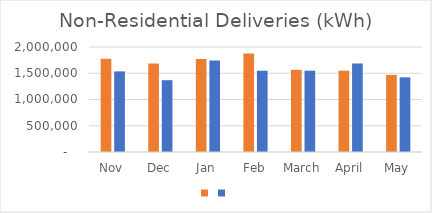
| Category | Series 1 | Series 0 |
|---|---|---|
| Nov | 1778480 | 1535448 |
| Dec | 1688051 | 1367905 |
| Jan | 1770828 | 1741151 |
| Feb | 1874770 | 1548063 |
| March | 1565360 | 1549153 |
| April | 1549578 | 1684688 |
| May | 1468470 | 1421957 |